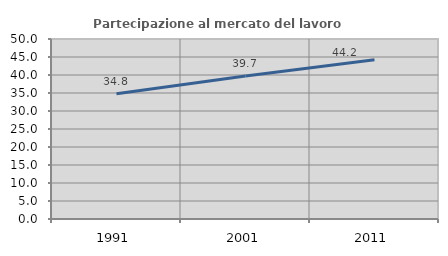
| Category | Partecipazione al mercato del lavoro  femminile |
|---|---|
| 1991.0 | 34.812 |
| 2001.0 | 39.748 |
| 2011.0 | 44.205 |